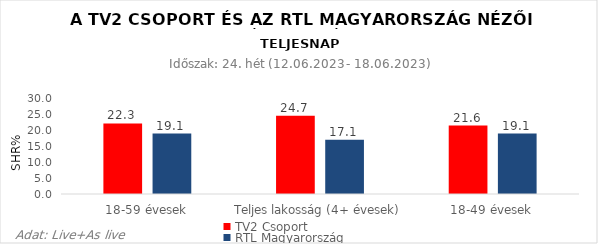
| Category | TV2 Csoport | RTL Magyarország |
|---|---|---|
| 18-59 évesek | 22.3 | 19.1 |
| Teljes lakosság (4+ évesek) | 24.7 | 17.1 |
| 18-49 évesek | 21.6 | 19.1 |